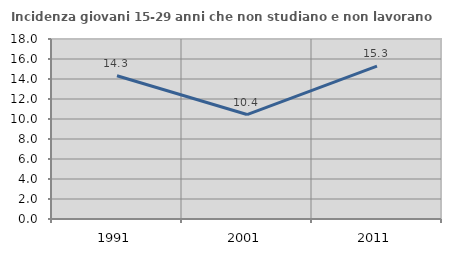
| Category | Incidenza giovani 15-29 anni che non studiano e non lavorano  |
|---|---|
| 1991.0 | 14.325 |
| 2001.0 | 10.444 |
| 2011.0 | 15.285 |